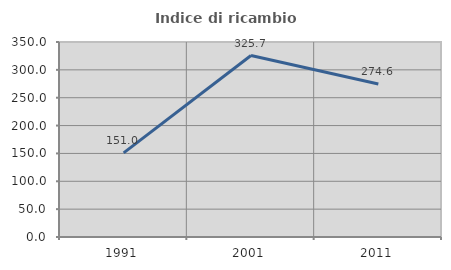
| Category | Indice di ricambio occupazionale  |
|---|---|
| 1991.0 | 151.02 |
| 2001.0 | 325.714 |
| 2011.0 | 274.576 |